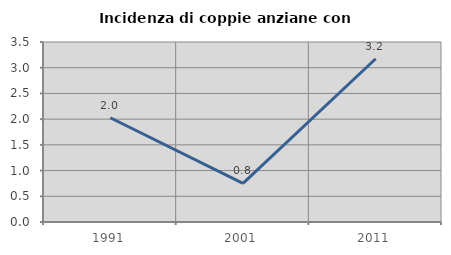
| Category | Incidenza di coppie anziane con figli |
|---|---|
| 1991.0 | 2.027 |
| 2001.0 | 0.752 |
| 2011.0 | 3.175 |